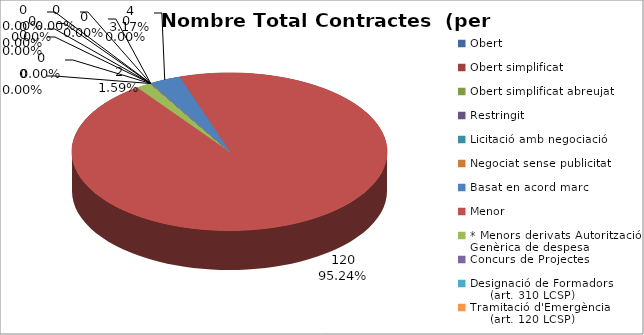
| Category | Nombre Total Contractes |
|---|---|
| Obert | 0 |
| Obert simplificat | 0 |
| Obert simplificat abreujat | 0 |
| Restringit | 0 |
| Licitació amb negociació | 0 |
| Negociat sense publicitat | 0 |
| Basat en acord marc | 4 |
| Menor | 120 |
| * Menors derivats Autorització Genèrica de despesa | 2 |
| Concurs de Projectes | 0 |
| Designació de Formadors
     (art. 310 LCSP) | 0 |
| Tramitació d'Emergència
     (art. 120 LCSP) | 0 |